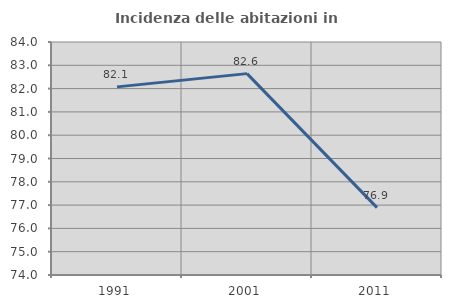
| Category | Incidenza delle abitazioni in proprietà  |
|---|---|
| 1991.0 | 82.074 |
| 2001.0 | 82.643 |
| 2011.0 | 76.893 |